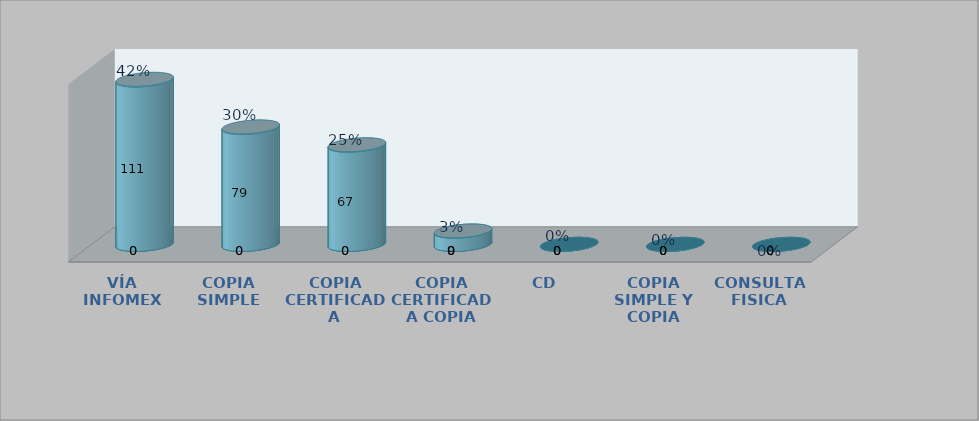
| Category | Series 0 | Series 1 | Series 2 | Series 3 |
|---|---|---|---|---|
| VÍA INFOMEX |  |  | 111 | 0.417 |
| COPIA SIMPLE |  |  | 79 | 0.297 |
| COPIA CERTIFICADA |  |  | 67 | 0.252 |
| COPIA CERTIFICADA COPIA SIMPLE |  |  | 9 | 0.034 |
| CD |  |  | 0 | 0 |
| COPIA SIMPLE Y COPIA DIGITAL |  |  | 0 | 0 |
| CONSULTA FISICA |  |  | 0 | 0 |